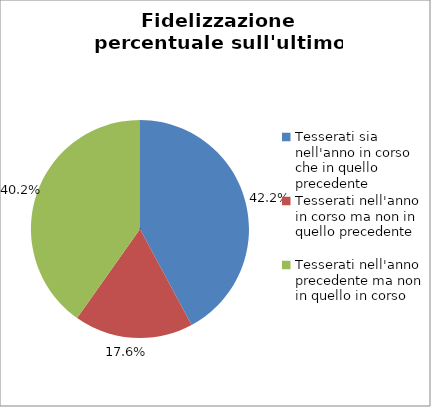
| Category | Nr. Tesserati |
|---|---|
| Tesserati sia nell'anno in corso che in quello precedente | 282 |
| Tesserati nell'anno in corso ma non in quello precedente | 118 |
| Tesserati nell'anno precedente ma non in quello in corso | 269 |